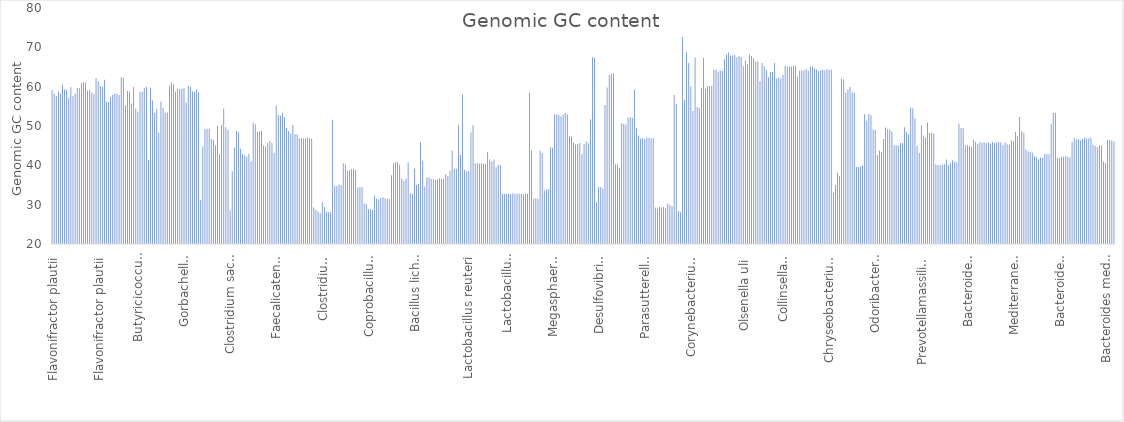
| Category | Series 0 |
|---|---|
| Flavonifractor plautii | 59.13 |
| Flavonifractor plautii | 58.22 |
| Flavonifractor plautii | 57.6 |
| Flavonifractor plautii | 58.85 |
| Flavonifractor plautii | 58.2 |
| Flavonifractor plautii  | 60.4 |
| Flavonifractor plautii | 59.27 |
| Pseudoflavonifractor phocaeensis | 59.2 |
| Flavonifractor plautii | 57.15 |
| Pseudoflavonifractor capillosus | 59.87 |
| Pseudoflavonifractor phocaeensis | 57.6 |
| Pseudoflavonifractor phocaeensis | 58.2 |
| Pseudoflavonifractor phocaeensis | 59.7 |
| Pseudoflavonifractor phocaeensis  | 59.6 |
| Flavonifractor plautii | 60.9 |
| Flavonifractor plautii  | 61.2 |
| Flavonifractor plautii | 60.99 |
| Flavonifractor plautii | 59 |
| Pseudoflavonifractor phocaeensis  | 59.3 |
| Pseudoflavonifractor phocaeensis | 58.5 |
| Intestinimonas butyriciproducens | 58.2 |
| Flavonifractor plautii | 62.13 |
| Flavonifractor plautii | 61.45 |
| Pseudoflavonifractor phocaeensis | 60.2 |
| Pseudoflavonifractor phocaeensis | 60 |
| Flavonifractor plautii | 61.74 |
| Pseudoflavonifractor capillosus | 56.2 |
| Pseudoflavonifractor capillosus | 56.1 |
| Pseudoflavonifractor capillosus | 57.41 |
| Pseudoflavonifractor capillosus | 57.97 |
| Pseudoflavonifractor capillosus | 58.19 |
| Pseudoflavonifractor capillosus  | 58.2 |
| Oscillibacter valericigenes  | 57.9 |
| Oscillibacter valericigenes | 62.4 |
| Oscillibacter valericigenes | 62.2 |
| Oscillibacter ruminantium | 55.3 |
| Oscillibacter valericigenes  | 58.9 |
| Oscillibacter valericigenes | 58.8 |
| Intestinimonas butyriciproducens | 55.7 |
| Butyricicoccus pullicaecorum | 59.9 |
| Butyricicoccus pullicaecorum | 54.43 |
| Butyricicoccus pullicaecorum | 53.61 |
| Agathobaculum desmolans | 58.7 |
| Agathobaculum desmolans | 58.7 |
| Butyricicoccus pullicaecorum | 59.7 |
| Butyricicoccus pullicaecorum | 60 |
| Anaeromassilibacillus senegalensis | 41.4 |
| Neglecta timonensis | 59.7 |
| Anaeromassilibacillus senegalensis  | 56.5 |
| Anaeromassilibacillus senegalensis | 53.28 |
| Anaeromassilibacillus senegalensis | 54.3 |
| Phocea massiliensis | 48.3 |
| Hydrogenoanaerobacterium saccharovorans | 56.2 |
| Anaerotruncus colihominis | 54.6 |
| Anaerotruncus colihominis | 53.46 |
| Anaerotruncus colihominis | 53.45 |
| Anaerofilum agile | 60.34 |
| Faecalibacterium prausnitzii | 61.06 |
| Faecalibacterium prausnitzii | 60.63 |
| Faecalibacterium prausnitzii | 58.8 |
| Faecalibacterium prausnitzii | 59.48 |
| Faecalibacterium prausnitzii | 59.47 |
| Fournierella massiliensis | 59.5 |
| Gemmiger formicilis | 59.6 |
| Gemmiger formicilis | 56 |
| Gemmiger formicilis | 60.15 |
| Gorbachella massiliensis | 59.9 |
| Fournierella massiliensis | 58.8 |
| Gemmiger formicilis | 58.67 |
| Gemmiger formicilis | 59.3 |
| Gemmiger formicilis | 58.58 |
| Clostridium lactatifermentans | 31.21 |
| Clostridium lactatifermentans | 44.78 |
| Anaerotignum lactatifermentans | 49.2 |
| Anaerotignum lactatifermentans | 49.3 |
| Anaerotignum lactatifermentans | 49.3 |
| Eubacterium hallii | 46.78 |
| Eubacterium hallii | 46.43 |
| Blautia schinkii | 45.08 |
| Clostridium saccharolyticum | 50.05 |
| Clostridium saccharolyticum  | 42.8 |
| Clostridium saccharolyticum | 50.31 |
| Clostridium saccharolyticum | 54.42 |
| Clostridium aldenense | 49.7 |
| Clostridium clostridioforme | 49 |
| Clostridium bolteae | 28.6 |
| Roseburia hominis | 38.5 |
| Blautia producta | 44.56 |
| Clostridium saccharolyticum | 48.8 |
| Clostridium saccharolyticum | 48.5 |
| Blautia producta  | 44.2 |
| Ruminococcus gnavus | 42.9 |
| Eubacterium contortum | 42.5 |
| Eubacterium contortum  | 42.2 |
| Eubacterium contortum | 42.9 |
| Eubacterium contortum | 41 |
| Eubacterium fissicatena | 50.87 |
| Eubacterium fissicatena | 50.44 |
| Mordavella massiliensis | 48.5 |
| Mordavella massiliensis | 48.6 |
| Mordavella massiliensis | 48.8 |
| Drancourtella massiliensis | 45.07 |
| Drancourtella massiliensis | 44.76 |
| Drancourtella massiliensis | 45.72 |
| Drancourtella massiliensis | 46.18 |
| Drancourtella massiliensis  | 45.7 |
| Clostridium oroticum | 43.19 |
| Lachnoclostridium phocaeense | 55.2 |
| Eubacterium contortum | 52.8 |
| Faecalicatena contorta | 52.6 |
| Faecalicatena fissicatena | 53.4 |
| Eubacterium contortum | 52.25 |
| Clostridium glycyrrhizinilyticum | 49.44 |
| Mediterraneibacter massiliensis | 48.7 |
| Clostridium glycyrrhizinilyticum  | 48.1 |
| Clostridium glycyrrhizinilyticum | 50.34 |
| Faecalicatena orotica | 47.9 |
| Ruminococcus torques | 47.9 |
| Clostridium glycyrrhizinilyticum | 46.8 |
| Clostridium glycyrrhizinilyticum | 47 |
| Clostridium glycyrrhizinilyticum | 46.8 |
| Clostridium glycyrrhizinilyticum | 46.9 |
| Clostridium glycyrrhizinilyticum | 47.1 |
| Clostridium glycyrrhizinilyticum | 46.8 |
| Clostridium glycyrrhizinilyticum | 46.76 |
| Paraclostridium benzoelyticum | 29.3 |
| Clostridioides difficile | 28.7 |
| Clostridium sporogenes | 28.2 |
| Clostridium saudiense | 27.9 |
| Clostridium saudiense | 30.6 |
| Clostridium saudiense | 29.4 |
| Clostridium perfringens | 28.2 |
| Clostridium perfringens | 28.07 |
| Clostridium perfringens | 28.06 |
| Absiella dolichum | 51.6 |
| Eubacterium cylindroides | 34.8 |
| Eubacterium cylindroides | 34.75 |
| Eubacterium cylindroides  | 35.1 |
| Eubacterium cylindroides  | 35 |
| Faecalicoccus acidiformans | 40.5 |
| Faecalicoccus acidiformans | 40.2 |
| Faecalicoccus pleomorphus | 38.6 |
| Faecalicoccus pleomorphus | 38.7 |
| Streptococcus pleomorphus  | 39 |
| Faecalicoccus pleomorphus  | 39.2 |
| Streptococcus pleomorphus  | 38.8 |
| Faecalibacillus faecis | 34.3 |
| Faecalibacillus faecis | 34.4 |
| Faecalibacillus faecis | 34.4 |
| Clostridium spiroforme | 30.24 |
| Clostridium spiroforme | 30.12 |
| Clostridium spiroforme | 28.9 |
| Clostridium spiroforme | 28.86 |
| Clostridium spiroforme | 28.58 |
| Coprobacillus cateniformis  | 32.3 |
| Massiliomicrobiota timonensis | 31.46 |
| Massiliomicrobiota timonensis  | 31.3 |
| Massiliomicrobiota timonensis | 31.69 |
| Massiliomicrobiota timonensis | 31.88 |
| Massiliomicrobiota timonensis | 31.6 |
| Massiliomicrobiota timonensis | 31.58 |
| Massiliomicrobiota timonensis | 31.51 |
| Streptococcus pasteurianus | 37.5 |
| Streptococcus alactolyticus | 40.5 |
| Streptococcus alactolyticus  | 40.8 |
| Streptococcus alactolyticus | 40.8 |
| Enterococcus gallinarum  | 40.2 |
| Enterococcus cecorum | 36.66 |
| Enterococcus cecorum | 36.1 |
| Enterococcus cecorum | 36.6 |
| Enterococcus cecorum | 40.8 |
| Staphylococcus saprophyticus | 32.9 |
| Staphylococcus saprophyticus | 32.7 |
| Oceanobacillus oncorhynchi | 39.2 |
| Bacillus cereus  | 35 |
| Bacillus circulans  | 35.3 |
| Bacillus licheniformis | 45.9 |
| Bacillus stratosphericus | 41.2 |
| Lactobacillus gasseri | 34.6 |
| Lactobacillus crispatus  | 36.9 |
| Lactobacillus crispatus | 36.9 |
| Lactobacillus gallinarum | 36.5 |
| Lactobacillus gallinarum | 36.47 |
| Lactobacillus gallinarum | 36.3 |
| Lactobacillus gallinarum | 36.4 |
| Lactobacillus gallinarum | 36.7 |
| Lactobacillus gallinarum | 36.54 |
| Lactobacillus gallinarum | 36.52 |
| Weissella paramesenteroides | 37.8 |
| Pediococcus pentosaceus | 37.3 |
| Weissella jogaejeotgali | 38.6 |
| Pediococcus acidilactici | 43.8 |
| Lactobacillus coleohominis | 39.1 |
| Lactobacillus coleohominis | 39.1 |
| Lactobacillus ingluviei | 50.3 |
| Lactobacillus alvi  | 42.6 |
| Lactobacillus coleohominis | 58.1 |
| Lactobacillus reuteri  | 38.8 |
| Lactobacillus reuteri | 38.5 |
| Lactobacillus reuteri | 38.47 |
| Lactobacillus panis | 48.4 |
| Lactobacillus pontis | 50.2 |
| Lactobacillus vaginalis | 40.5 |
| Lactobacillus vaginalis | 40.5 |
| Lactobacillus vaginalis | 40.4 |
| Lactobacillus vaginalis | 40.5 |
| Lactobacillus vaginalis | 40.4 |
| Lactobacillus vaginalis | 40.4 |
| Lactobacillus ruminis  | 43.4 |
| Lactobacillus agilis  | 41.5 |
| Lactobacillus agilis | 41 |
| Lactobacillus agilis  | 41.5 |
| Lactobacillus aviarius | 39.5 |
| Lactobacillus aviarius | 40.1 |
| Lactobacillus aviarius | 40 |
| Lactobacillus salivarius | 32.8 |
| Lactobacillus salivarius | 32.76 |
| Lactobacillus salivarius | 32.75 |
| Ligilactobacillus salivarius | 32.7 |
| Lactobacillus salivarius | 32.74 |
| Lactobacillus salivarius  | 32.9 |
| Lactobacillus salivarius  | 32.8 |
| Lactobacillus salivarius | 32.8 |
| Lactobacillus salivarius | 32.8 |
| Lactobacillus salivarius | 32.7 |
| Lactobacillus salivarius | 32.6 |
| Lactobacillus salivarius  | 32.8 |
| Lactobacillus salivarius | 32.7 |
| Mitsuokella multacida | 58.4 |
| Anaerovibrio lipolyticus | 43.8 |
| Megamonas funiformis  | 31.5 |
| Megamonas rupellensis | 31.6 |
| Megamonas funiformis  | 31.5 |
| Megamonas hypermegale | 43.7 |
| Megamonas hypermegale | 43.1 |
| Megamonas hypermegale | 33.61 |
| Megamonas hypermegale | 33.8 |
| Megamonas hypermegale  | 33.9 |
| Veillonella magna | 44.6 |
| Veillonella magna | 44.5 |
| Megasphaera elsdenii  | 52.9 |
| Megasphaera elsdenii | 53 |
| Megasphaera hexanoica | 52.8 |
| Megasphaera stantonii | 52.4 |
| Megasphaera stantonii | 53 |
| Megasphaera elsdenii | 53.29 |
| Megasphaera elsdenii  | 52.9 |
| Phascolarctobacterium succinatutens | 47.4 |
| Phascolarctobacterium succinatutens | 47.4 |
| Phascolarctobacterium faecium | 45.8 |
| Phascolarctobacterium faecium | 45.3 |
| Phascolarctobacterium faecium | 45.4 |
| Phascolarctobacterium faecium | 45.7 |
| Phascolarctobacterium faecium | 42.8 |
| Phascolarctobacterium faecium | 45.4 |
| Phascolarctobacterium faecium | 46.1 |
| Phascolarctobacterium faecium | 45.6 |
| Elusimicrobium minutum | 51.73 |
| Brevundimonas olei | 67.5 |
| Brevundimonas diminuta | 67.3 |
| Campylobacter jejuni | 30.6 |
| Helicobacter pullorum | 34.5 |
| Helicobacter pullorum | 34.5 |
| Helicobacter pullorum | 34.1 |
| Desulfovibrio desulfuricans | 55.37 |
| Desulfovibrio desulfuricans | 59.8 |
| Desulfovibrio piger | 63 |
| Desulfovibrio piger | 63.3 |
| Desulfovibrio piger | 63.4 |
| Succinatimonas hippei | 40.3 |
| Succinatimonas hippei | 40.2 |
| Gallibacterium anatis | 39.4 |
| Escherichia coli | 50.7 |
| Escherichia coli | 50.48 |
| Escherichia coli | 50.4 |
| Salmonella Enteritidis | 52.1 |
| Salmonella Typhimurium | 52.2 |
| Salmonella Typhimurium | 52.1 |
| Sutterella massiliensis  | 59.2 |
| Parasutterella secunda | 49.5 |
| Parasutterella secunda | 47.6 |
| Parasutterella secunda | 46.8 |
| Parasutterella secunda | 46.9 |
| Parasutterella secunda | 46.6 |
| Parasutterella secunda | 47.1 |
| Parasutterella secunda | 47 |
| Parasutterella secunda | 46.9 |
| Parasutterella secunda | 46.9 |
| Fusobacterium perfoetens | 29.3 |
| Fusobacterium perfoetens | 28.9 |
| Fusobacterium varium | 29.4 |
| Fusobacterium varium  | 29.3 |
| Fusobacterium mortiferum | 29.4 |
| Fusobacterium mortiferum  | 29.1 |
| Fusobacterium mortiferum  | 30.3 |
| Fusobacterium mortiferum | 29.9 |
| Fusobacterium mortiferum | 29.6 |
| Cloacibacillus porcorum | 57.89 |
| Akkermansia muciniphila | 55.68 |
| Brachyspira innocens | 28.4 |
| Brachyspira innocens | 28.1 |
| Cellulomonas cellasea | 72.6 |
| Arcanobacterium haemolyticum | 56.6 |
| Actinomyces viscosus | 68.8 |
| Schaalia hyovaginalis | 66 |
| Cutibacterium acnes | 60.1 |
| Corynebacterium glutamicum | 53.8 |
| Corynebacterium variabile | 67.4 |
| Corynebacterium stationis | 54.8 |
| Corynebacterium stationis | 54.6 |
| Bifidobacterium stercoris | 59.7 |
| Bifidobacterium saeculare | 67.3 |
| Bifidobacterium boum | 59.5 |
| Bifidobacterium porcinum | 60.1 |
| Bifidobacterium thermophilum | 60.2 |
| Bifidobacterium porcinum | 60.2 |
| Bifidobacterium saeculare | 64.3 |
| Bifidobacterium saeculare | 64.3 |
| Bifidobacterium saeculare | 63.8 |
| Bifidobacterium saeculare | 64.1 |
| Bifidobacterium saeculare | 64 |
| Olsenella uli | 66.98 |
| Olsenella uli | 68.09 |
| Olsenella uli | 68.68 |
| Olsenella uli | 67.9 |
| Olsenella uli | 67.87 |
| Olsenella uli | 68.1 |
| Olsenella uli | 67.5 |
| Olsenella uli | 67.8 |
| Olsenella uli | 67.55 |
| Olsenella uli | 65.2 |
| Olsenella uli | 66.6 |
| Olsenella uli | 65.7 |
| Olsenella profusa | 68.2 |
| Olsenella uli | 67.8 |
| Olsenella uli | 67.2 |
| Olsenella uli | 66.4 |
| Olsenella uli | 66.4 |
| Slackia piriformis | 61.4 |
| Gordonibacter urolithinfaciens | 65.99 |
| Gordonibacter urolithinfaciens | 65.16 |
| Gordonibacter urolithinfaciens | 64.16 |
| Collinsella tanakaei | 62.39 |
| Enorma phocaeensis | 63.7 |
| Enorma phocaeensis | 63.7 |
| Enorma timonensis | 65.99 |
| Enorma massiliensis | 62.09 |
| Enorma massiliensis | 62.3 |
| Enorma massiliensis | 62.1 |
| Collinsella intestinalis | 62.95 |
| Collinsella intestinalis | 65.33 |
| Collinsella intestinalis | 65.1 |
| Collinsella intestinalis | 65.1 |
| Collinsella intestinalis | 65.1 |
| Collinsella intestinalis | 65.4 |
| Collinsella intestinalis | 65.28 |
| Collinsella tanakaei | 62.5 |
| Collinsella tanakaei | 64.1 |
| Collinsella tanakaei | 64.2 |
| Collinsella tanakaei | 64.2 |
| Collinsella tanakaei | 64.5 |
| Collinsella tanakaei | 64 |
| Collinsella tanakaei | 65.2 |
| Collinsella tanakaei | 65.2 |
| Collinsella tanakaei | 64.6 |
| Collinsella tanakaei | 64.34 |
| Collinsella tanakaei | 63.9 |
| Collinsella tanakaei | 64.2 |
| Collinsella tanakaei | 64.3 |
| Collinsella tanakaei | 64.2 |
| Collinsella tanakaei | 64.4 |
| Collinsella tanakaei | 64.3 |
| Collinsella tanakaei | 64.3 |
| Empedobacter brevis | 33 |
| Chryseobacterium formosense | 35 |
| Chryseobacterium indologenes | 38.1 |
| Chryseobacterium indologenes | 37.3 |
| Alistipes senegalensis | 62 |
| Alistipes senegalensis | 61.85 |
| Alistipes onderdonkii | 58.52 |
| Alistipes senegalensis | 59.37 |
| Alistipes senegalensis | 59.9 |
| Alistipes senegalensis | 58.57 |
| Alistipes shahii | 58.38 |
| Sphingobacterium multivorum | 39.6 |
| Sphingobacterium multivorum | 39.6 |
| Sphingobacterium siyangense | 39.7 |
| Sphingobacterium multivorum | 40 |
| Barnesiella viscericola | 53 |
| Barnesiella viscericola | 51.37 |
| Barnesiella viscericola | 53.04 |
| Barnesiella viscericola | 52.7 |
| Muribaculum intestinale | 49.09 |
| Muribaculum intestinale | 49.04 |
| Butyricimonas paravirosa | 42.63 |
| Odoribacter splanchnicus | 43.75 |
| Odoribacter splanchnicus | 43.48 |
| Parabacteroides merdae | 46.69 |
| Parabacteroides distasonis | 49.6 |
| Parabacteroides distasonis | 49.2 |
| Parabacteroides distasonis | 49.1 |
| Parabacteroides distasonis | 48.6 |
| Parabacteroides johnsonii | 45.03 |
| Parabacteroides distasonis | 45.11 |
| Parabacteroides distasonis | 45 |
| Prevotella brevis | 45.7 |
| Prevotella brevis | 45.6 |
| Prevotella loescheii | 49.7 |
| Prevotella shahii | 48.5 |
| Marseilla massiliensis | 47.9 |
| Marseilla massiliensis | 54.7 |
| Marseilla massiliensis | 54.5 |
| Prevotella dentalis | 52 |
| Prevotella copri | 44.9 |
| Prevotella copri | 43.2 |
| Prevotella stercorea | 50.1 |
| Prevotella stercorea | 47.6 |
| Prevotella stercorea | 47.1 |
| Prevotellamassilia timonensis | 50.8 |
| Bacteroides gallinaceum | 48.2 |
| Bacteroides gallinaceum | 48.3 |
| Bacteroides gallinaceum | 48.1 |
| Bacteroides caecigallinarum | 40.2 |
| Bacteroides caecigallinarum | 40.1 |
| Bacteroides caecigallinarum | 40 |
| Bacteroides caecigallinarum | 40.1 |
| Bacteroides caecigallinarum | 40.3 |
| Bacteroides caecigallinarum | 41.5 |
| Bacteroides caecigallinarum | 40 |
| Bacteroides caecigallinarum | 40.5 |
| Bacteroides caecigallinarum | 41.3 |
| Bacteroides caecigallinarum | 40.9 |
| Bacteroides caecigallinarum | 40.8 |
| Bacteroides helcogenes | 50.6 |
| Paraphocaeicola brunensis | 49.5 |
| Mediterranea massiliensis | 49.41 |
| Bacteroides caecicola | 45.1 |
| Bacteroides caecicola | 45.1 |
| Bacteroides salanitronis | 44.84 |
| Bacteroides salanitronis | 44.6 |
| Bacteroides caecicola | 46.5 |
| Bacteroides gallinaceum | 46 |
| Bacteroides gallinaceum | 45.4 |
| Bacteroides gallinaceum | 45.87 |
| Bacteroides gallinaceum | 45.8 |
| Bacteroides gallinaceum | 45.79 |
| Bacteroides gallinaceum | 45.7 |
| Bacteroides gallinaceum | 45.88 |
| Bacteroides gallinaceum | 45.5 |
| Bacteroides gallinaceum | 45.9 |
| Bacteroides gallinaceum | 45.6 |
| Bacteroides gallinaceum | 45.8 |
| Bacteroides gallinaceum | 46 |
| Bacteroides gallinaceum | 45.82 |
| Bacteroides eggerthii | 45.1 |
| Bacteroides pyogenes | 45.8 |
| Bacteroides clarus | 45.36 |
| Bacteroides clarus | 45.22 |
| Bacteroides uniformis | 46.36 |
| Bacteroides uniformis | 46.2 |
| Mediterranea massiliensis | 48.5 |
| Bacteroides rodentium | 47.4 |
| Mediterranea massiliensis | 52.3 |
| Mediterranea massiliensis | 48.7 |
| Mediterranea massiliensis | 48.3 |
| Bacteroides fragilis | 44 |
| Bacteroides fragilis | 43.6 |
| Bacteroides fragilis | 43.4 |
| Bacteroides fragilis | 43.2 |
| Bacteroides caccae | 42.3 |
| Bacteroides ovatus | 42.08 |
| Bacteroides xylanisolvens | 41.57 |
| Bacteroides xylanisolvens | 42 |
| Bacteroides xylanisolvens | 41.89 |
| Bacteroides thetaiotaomicron | 42.9 |
| Bacteroides thetaiotaomicron | 42.9 |
| Bacteroides thetaiotaomicron | 42.8 |
| Bacteroides coprophilus | 50.6 |
| Mediterranea massiliensis | 53.3 |
| Bacteroides coprophilus | 53.3 |
| Bacteroides dorei | 42 |
| Bacteroides dorei | 41.79 |
| Bacteroides vulgatus | 42.2 |
| Bacteroides vulgatus | 42.2 |
| Bacteroides vulgatus | 42.3 |
| Bacteroides vulgatus | 42.2 |
| Bacteroides vulgatus | 42 |
| Bacteroides coprophilus | 45.9 |
| Bacteroides barnesiae | 47 |
| Bacteroides barnesiae | 46.6 |
| Bacteroides barnesiae | 46.6 |
| Bacteroides barnesiae | 46.4 |
| Bacteroides barnesiae | 46.7 |
| Bacteroides barnesiae | 47.1 |
| Bacteroides barnesiae | 46.9 |
| Bacteroides barnesiae | 46.9 |
| Phocaeicola barnesiae | 47.1 |
| Bacteroides plebeius | 45.3 |
| Bacteroides plebeius | 45 |
| Bacteroides plebeius | 44.6 |
| Bacteroides plebeius | 45.1 |
| Bacteroides plebeius | 45 |
| Bacteroides coprocola | 41 |
| Bacteroides coprocola | 40.6 |
| Bacteroides mediterraneensis | 46.5 |
| Bacteroides mediterraneensis | 46.5 |
| Bacteroides mediterraneensis | 46.3 |
| Bacteroides mediterraneensis | 46.1 |